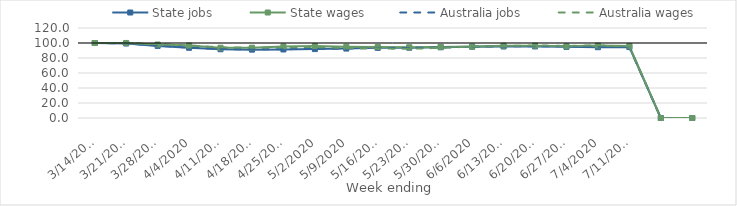
| Category | State jobs | State wages | Australia jobs | Australia wages |
|---|---|---|---|---|
| 14/03/2020 | 100 | 100 | 100 | 100 |
| 21/03/2020 | 99.275 | 100.054 | 99.345 | 99.743 |
| 28/03/2020 | 96.127 | 97.98 | 96.491 | 98.481 |
| 04/04/2020 | 93.607 | 96.563 | 93.819 | 96.778 |
| 11/04/2020 | 91.707 | 93.7 | 91.996 | 94.184 |
| 18/04/2020 | 91.143 | 93.701 | 91.451 | 94.032 |
| 25/04/2020 | 91.367 | 95.455 | 91.738 | 94.241 |
| 02/05/2020 | 91.881 | 96.036 | 92.109 | 94.689 |
| 09/05/2020 | 92.574 | 95.046 | 92.629 | 93.316 |
| 16/05/2020 | 93.504 | 94.644 | 93.158 | 92.67 |
| 23/05/2020 | 93.722 | 94.28 | 93.449 | 92.26 |
| 30/05/2020 | 94.252 | 94.793 | 94.006 | 93.552 |
| 06/06/2020 | 95.052 | 95.215 | 94.942 | 95.15 |
| 13/06/2020 | 95.319 | 96.359 | 95.443 | 95.811 |
| 20/06/2020 | 95.408 | 96.465 | 95.785 | 96.851 |
| 27/06/2020 | 94.84 | 95.657 | 95.571 | 95.974 |
| 04/07/2020 | 94.376 | 96.607 | 95.033 | 96.971 |
| 11/07/2020 | 94.534 | 95.902 | 94.423 | 95.167 |